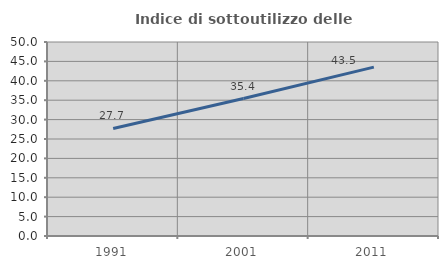
| Category | Indice di sottoutilizzo delle abitazioni  |
|---|---|
| 1991.0 | 27.709 |
| 2001.0 | 35.432 |
| 2011.0 | 43.517 |